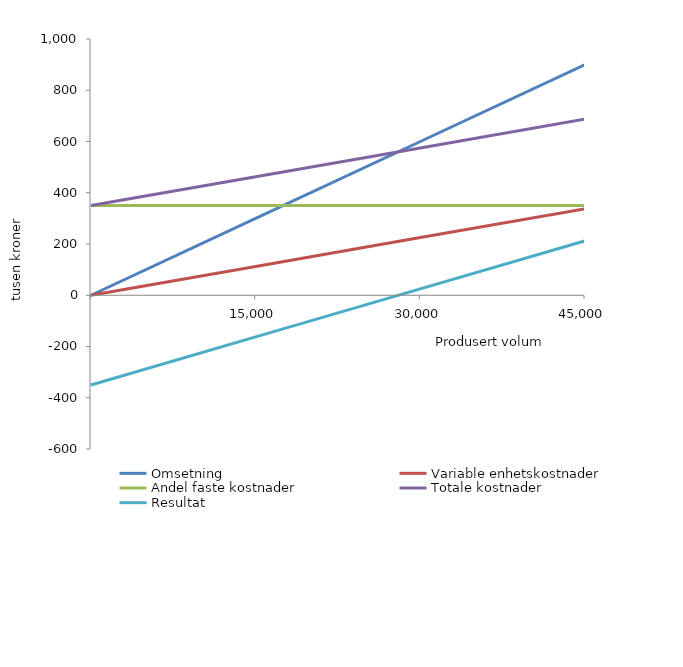
| Category | Omsetning  | Variable enhetskostnader  | Andel faste kostnader | Totale kostnader  | Resultat |
|---|---|---|---|---|---|
| nan | 0 | 0 | 350 | 350 | -350 |
| 15000.0 | 300 | 112.5 | 350 | 462.5 | -162.5 |
| 30000.0 | 600 | 225 | 350 | 575 | 25 |
| 45000.0 | 900 | 337.5 | 350 | 687.5 | 212.5 |